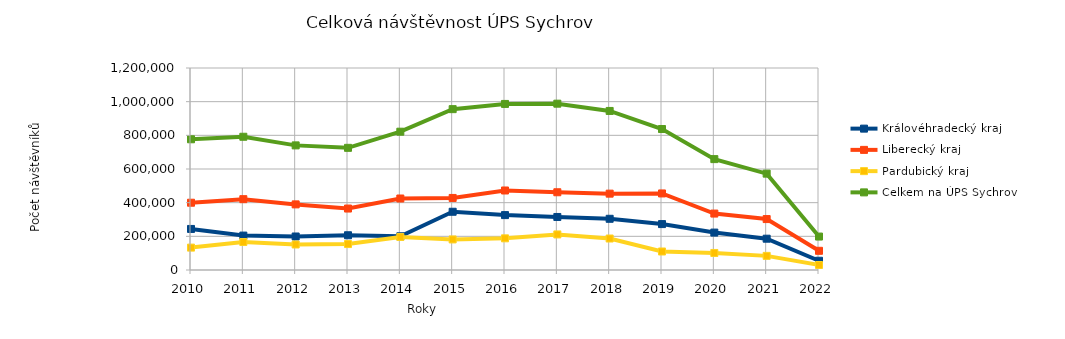
| Category | Královéhradecký kraj | Liberecký kraj | Pardubický kraj | Celkem na ÚPS Sychrov |
|---|---|---|---|---|
| 2010.0 | 243910 | 399672 | 133004 | 776586 |
| 2011.0 | 204481 | 420780 | 166238 | 791499 |
| 2012.0 | 199025 | 389781 | 151509 | 740315 |
| 2013.0 | 206419 | 365108 | 154165 | 725692 |
| 2014.0 | 200438 | 424718 | 196473 | 821629 |
| 2015.0 | 345970 | 428023 | 181567 | 955560 |
| 2016.0 | 326137 | 472318 | 188108 | 986563 |
| 2017.0 | 314983 | 461803 | 211268 | 988054 |
| 2018.0 | 304267 | 453568 | 187017 | 944852 |
| 2019.0 | 272720 | 454785 | 109949 | 837454 |
| 2020.0 | 222238 | 335261 | 101211 | 658710 |
| 2021.0 | 185934 | 302574 | 83925 | 572433 |
| 2022.0 | 54940 | 114005 | 29710 | 198655 |